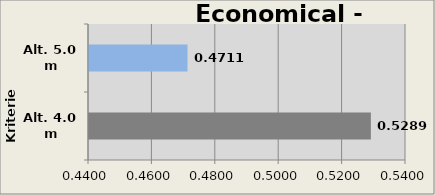
| Category | Bid Sum |
|---|---|
| Alt. 4.0 m | 0.529 |
| Alt. 5.0 m | 0.471 |